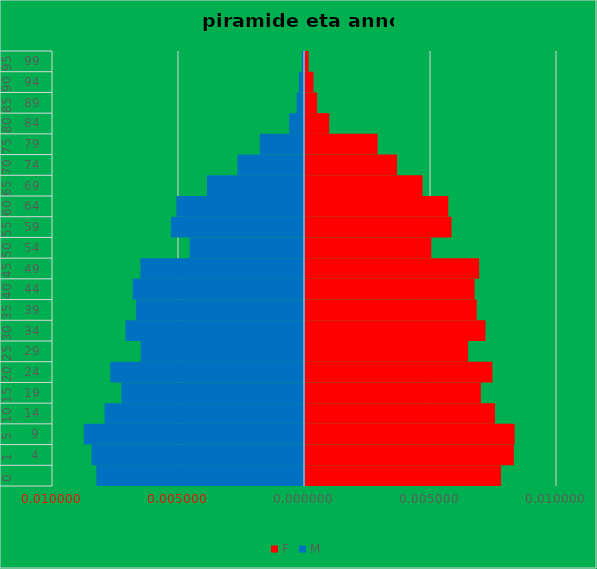
| Category | F | M |
|---|---|---|
| 0 | 0.008 | -0.008 |
| 1 | 0.008 | -0.008 |
| 2 | 0.008 | -0.009 |
| 3 | 0.008 | -0.008 |
| 4 | 0.007 | -0.007 |
| 5 | 0.007 | -0.008 |
| 6 | 0.006 | -0.006 |
| 7 | 0.007 | -0.007 |
| 8 | 0.007 | -0.007 |
| 9 | 0.007 | -0.007 |
| 10 | 0.007 | -0.006 |
| 11 | 0.005 | -0.005 |
| 12 | 0.006 | -0.005 |
| 13 | 0.006 | -0.005 |
| 14 | 0.005 | -0.004 |
| 15 | 0.004 | -0.003 |
| 16 | 0.003 | -0.002 |
| 17 | 0.001 | -0.001 |
| 18 | 0 | 0 |
| 19 | 0 | 0 |
| 20 | 0 | 0 |